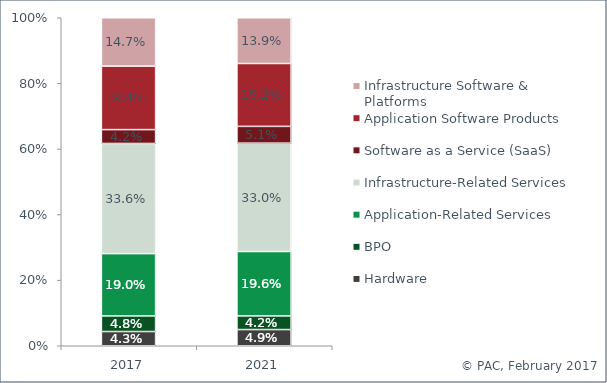
| Category | Hardware | BPO | Application-Related Services | Infrastructure-Related Services | Software as a Service (SaaS) | Application Software Products | Infrastructure Software & Platforms |
|---|---|---|---|---|---|---|---|
| 2017.0 | 0.043 | 0.048 | 0.19 | 0.336 | 0.042 | 0.194 | 0.147 |
| 2021.0 | 0.049 | 0.042 | 0.196 | 0.33 | 0.051 | 0.192 | 0.139 |